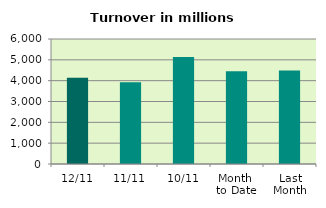
| Category | Series 0 |
|---|---|
| 12/11 | 4142.621 |
| 11/11 | 3928.88 |
| 10/11 | 5133.746 |
| Month 
to Date | 4448.238 |
| Last
Month | 4491.272 |